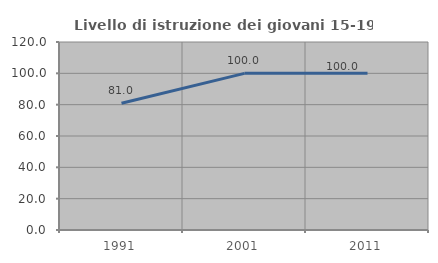
| Category | Livello di istruzione dei giovani 15-19 anni |
|---|---|
| 1991.0 | 80.952 |
| 2001.0 | 100 |
| 2011.0 | 100 |